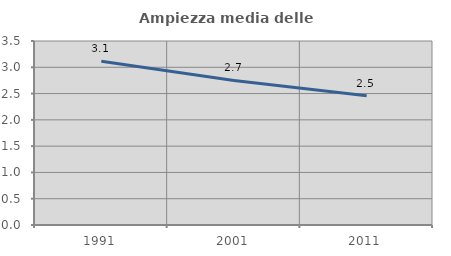
| Category | Ampiezza media delle famiglie |
|---|---|
| 1991.0 | 3.116 |
| 2001.0 | 2.749 |
| 2011.0 | 2.458 |